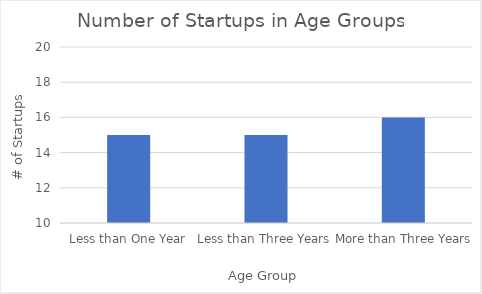
| Category | Series 0 |
|---|---|
| Less than One Year | 15 |
| Less than Three Years | 15 |
| More than Three Years | 16 |